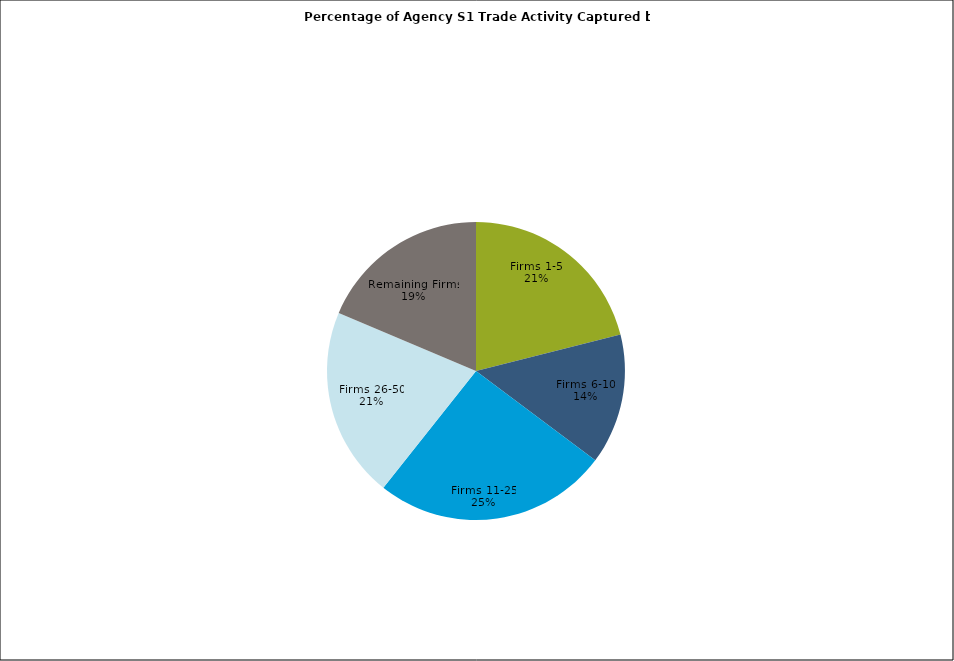
| Category | Series 0 |
|---|---|
| Firms 1-5 | 0.211 |
| Firms 6-10 | 0.142 |
| Firms 11-25 | 0.254 |
| Firms 26-50 | 0.207 |
| Remaining Firms | 0.186 |